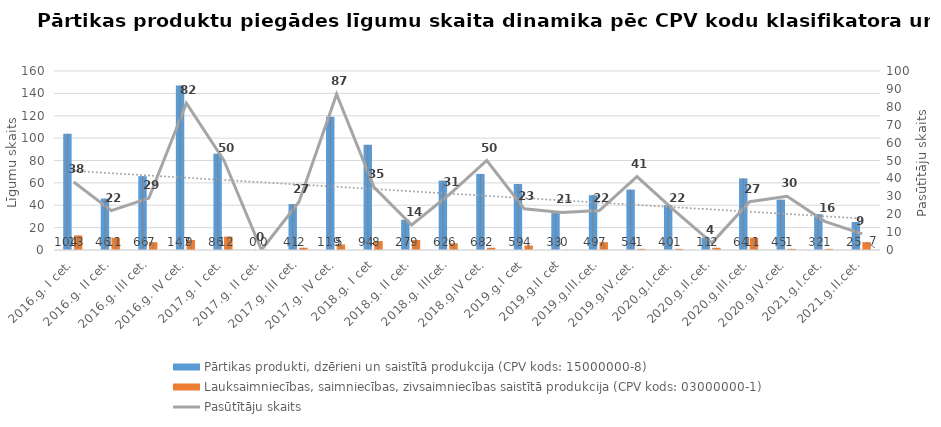
| Category | Pārtikas produkti, dzērieni un saistītā produkcija (CPV kods: 15000000-8) | Lauksaimniecības, saimniecības, zivsaimniecības saistītā produkcija (CPV kods: 03000000-1) |
|---|---|---|
| 2016.g. I cet. | 104 | 13 |
| 2016.g. II cet. | 46 | 11 |
| 2016.g. III cet. | 66 | 7 |
| 2016.g. IV cet. | 147 | 9 |
| 2017.g. I cet. | 86 | 12 |
| 2017.g. II cet. | 0 | 0 |
| 2017.g. III cet. | 41 | 2 |
| 2017.g. IV cet. | 119 | 5 |
| 2018.g. I cet | 94 | 8 |
| 2018.g. II cet. | 27 | 9 |
| 2018.g. IIIcet. | 62 | 6 |
| 2018.g.IV cet. | 68 | 2 |
| 2019.g.I cet | 59 | 4 |
| 2019.g.II cet | 33 | 0 |
| 2019.g.III.cet. | 49 | 7 |
| 2019.g.IV.cet. | 54 | 1 |
| 2020.g.I.cet. | 40 | 1 |
| 2020.g.II.cet. | 11 | 2 |
| 2020.g.III.cet. | 64 | 11 |
| 2020.g.IV.cet. | 45 | 1 |
| 2021.g.I.cet. | 32 | 1 |
| 2021.g.II.cet. | 25 | 7 |